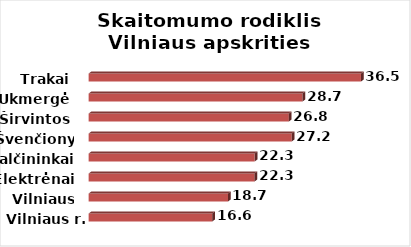
| Category | Series 0 |
|---|---|
| Vilniaus r. | 16.58 |
| Vilniaus m. | 18.69 |
| Elektrėnai | 22.25 |
| Šalčininkai | 22.26 |
| Švenčionys | 27.23 |
| Širvintos | 26.84 |
| Ukmergė | 28.67 |
| Trakai | 36.51 |